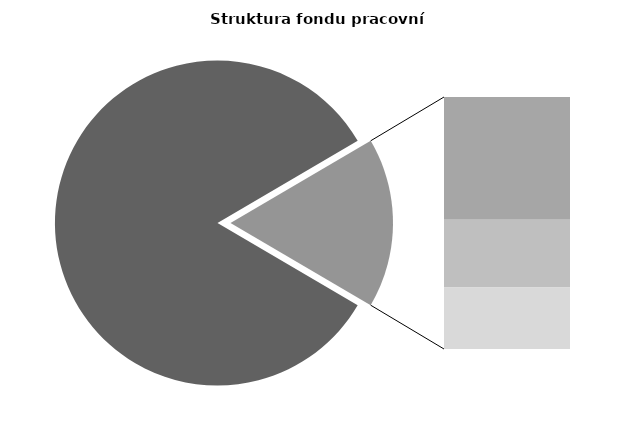
| Category | Series 0 |
|---|---|
| Průměrná měsíční odpracovaná doba bez přesčasu | 141.19 |
| Dovolená | 13.966 |
| Nemoc | 7.696 |
| Jiné | 7.011 |